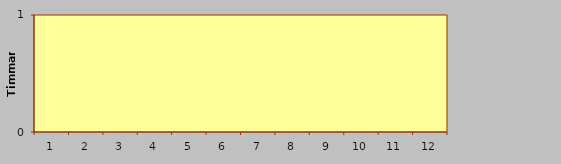
| Category | Flex totalt |
|---|---|
| 0 | 0 |
| 1 | 0 |
| 2 | 0 |
| 3 | 0 |
| 4 | 0 |
| 5 | 0 |
| 6 | 0 |
| 7 | 0 |
| 8 | 0 |
| 9 | 0 |
| 10 | 0 |
| 11 | 0 |